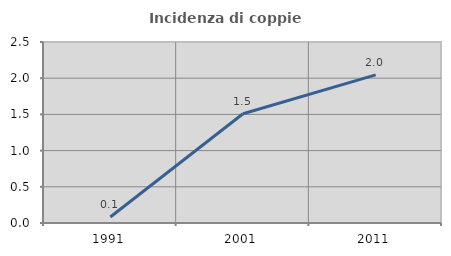
| Category | Incidenza di coppie miste |
|---|---|
| 1991.0 | 0.083 |
| 2001.0 | 1.509 |
| 2011.0 | 2.045 |